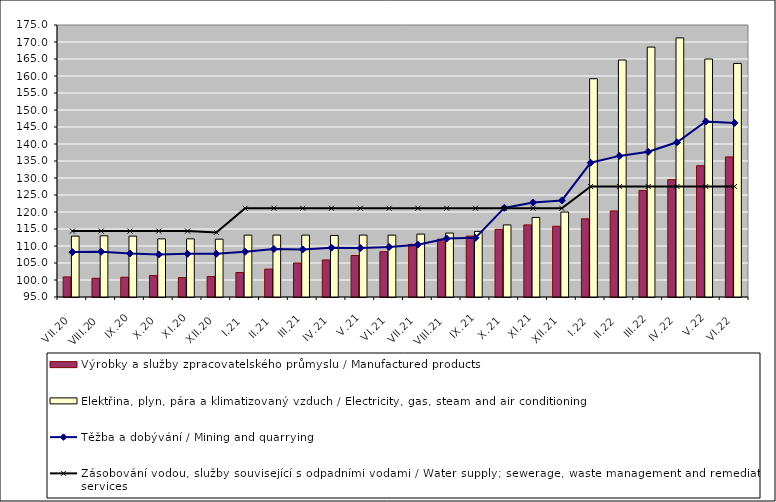
| Category | Výrobky a služby zpracovatelského průmyslu / Manufactured products | Elektřina, plyn, pára a klimatizovaný vzduch / Electricity, gas, steam and air conditioning |
|---|---|---|
| VII.20 | 100.9 | 112.9 |
| VIII.20 | 100.5 | 113 |
| IX.20 | 100.8 | 112.9 |
| X.20 | 101.3 | 112.1 |
| XI.20 | 100.7 | 112.1 |
| XII.20 | 101 | 112 |
| I.21 | 102.2 | 113.2 |
| II.21 | 103.2 | 113.2 |
| III.21 | 105 | 113.2 |
| IV.21 | 105.9 | 113.1 |
| V.21 | 107.2 | 113.2 |
| VI.21 | 108.3 | 113.2 |
| VII.21 | 110.5 | 113.5 |
| VIII.21 | 112 | 113.8 |
| IX.21 | 112.9 | 114.3 |
| X.21 | 114.9 | 116.2 |
| XI.21 | 116.2 | 118.4 |
| XII.21 | 115.8 | 120 |
| I.22 | 118 | 159.2 |
| II.22 | 120.3 | 164.7 |
| III.22 | 126.3 | 168.5 |
| IV.22 | 129.5 | 171.2 |
| V.22 | 133.6 | 165 |
| VI.22 | 136.2 | 163.7 |